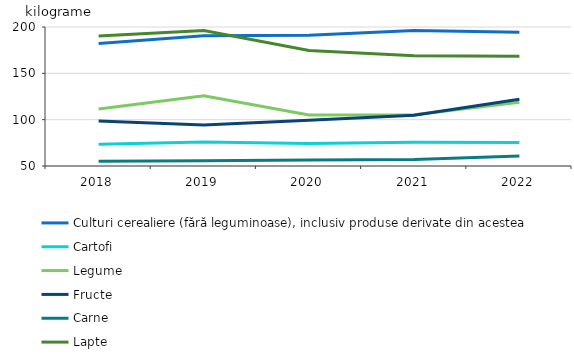
| Category | Culturi cerealiere (fără leguminoase), inclusiv produse derivate din acestea | Cartofi | Legume | Fructe | Carne | Lapte |
|---|---|---|---|---|---|---|
| 2018.0 | 182.2 | 73.4 | 111.6 | 98.5 | 55.2 | 190.2 |
| 2019.0 | 190.5 | 76 | 125.9 | 94.3 | 55.6 | 196.1 |
| 2020.0 | 191.2 | 74.2 | 105 | 99.5 | 56.5 | 174.6 |
| 2021.0 | 196.3 | 75.7 | 105.2 | 104.7 | 56.9 | 169.1 |
| 2022.0 | 194.3 | 75.4 | 118.7 | 122.1 | 60.8 | 168.4 |